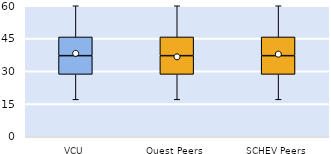
| Category | 25th | 50th | 75th |
|---|---|---|---|
| VCU | 28.571 | 8.571 | 8.571 |
| Quest Peers | 28.571 | 8.571 | 8.571 |
| SCHEV Peers | 28.571 | 8.571 | 8.571 |